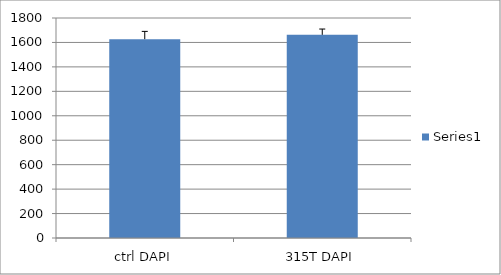
| Category | Series 0 |
|---|---|
| ctrl DAPI | 1626.81 |
| 315T DAPI | 1662.407 |